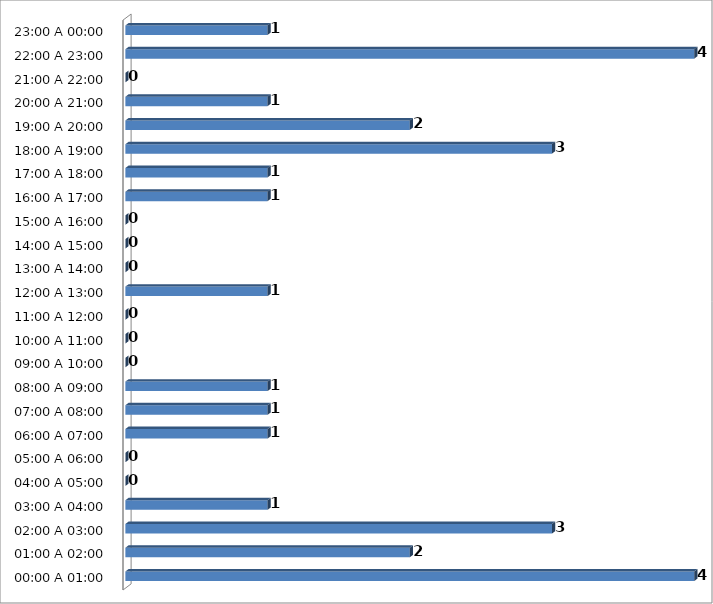
| Category | Series 0 |
|---|---|
| 00:00 A 01:00 | 4 |
| 01:00 A 02:00 | 2 |
| 02:00 A 03:00 | 3 |
| 03:00 A 04:00 | 1 |
| 04:00 A 05:00 | 0 |
| 05:00 A 06:00 | 0 |
| 06:00 A 07:00 | 1 |
| 07:00 A 08:00 | 1 |
| 08:00 A 09:00 | 1 |
| 09:00 A 10:00 | 0 |
| 10:00 A 11:00 | 0 |
| 11:00 A 12:00 | 0 |
| 12:00 A 13:00 | 1 |
| 13:00 A 14:00 | 0 |
| 14:00 A 15:00 | 0 |
| 15:00 A 16:00 | 0 |
| 16:00 A 17:00 | 1 |
| 17:00 A 18:00 | 1 |
| 18:00 A 19:00 | 3 |
| 19:00 A 20:00 | 2 |
| 20:00 A 21:00 | 1 |
| 21:00 A 22:00 | 0 |
| 22:00 A 23:00 | 4 |
| 23:00 A 00:00 | 1 |